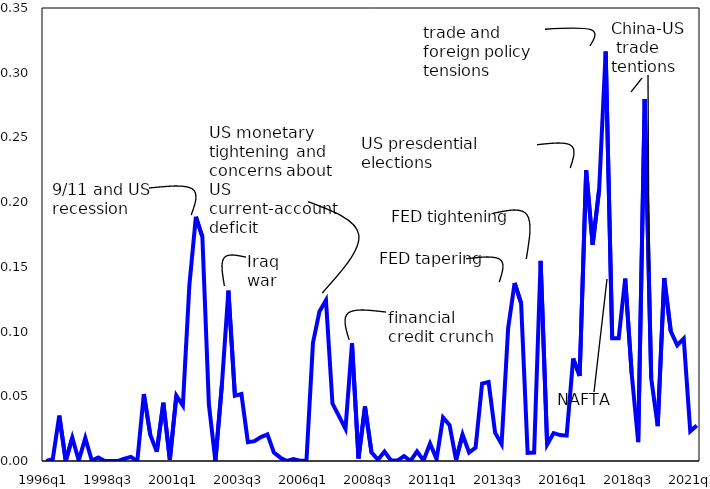
| Category | Series 0 |
|---|---|
| 1996q1 | 0 |
| 1996q2 | 0.001 |
| 1996q3 | 0.035 |
| 1996q4 | 0 |
| 1997q1 | 0.018 |
| 1997q2 | 0 |
| 1997q3 | 0.018 |
| 1997q4 | 0 |
| 1998q1 | 0.003 |
| 1998q2 | 0 |
| 1998q3 | 0 |
| 1998q4 | 0 |
| 1999q1 | 0.002 |
| 1999q2 | 0.003 |
| 1999q3 | 0 |
| 1999q4 | 0.052 |
| 2000q1 | 0.02 |
| 2000q2 | 0.007 |
| 2000q3 | 0.045 |
| 2000q4 | 0.001 |
| 2001q1 | 0.05 |
| 2001q2 | 0.043 |
| 2001q3 | 0.136 |
| 2001q4 | 0.189 |
| 2002q1 | 0.173 |
| 2002q2 | 0.044 |
| 2002q3 | 0 |
| 2002q4 | 0.059 |
| 2003q1 | 0.132 |
| 2003q2 | 0.05 |
| 2003q3 | 0.052 |
| 2003q4 | 0.015 |
| 2004q1 | 0.015 |
| 2004q2 | 0.018 |
| 2004q3 | 0.021 |
| 2004q4 | 0.006 |
| 2005q1 | 0.003 |
| 2005q2 | 0 |
| 2005q3 | 0.001 |
| 2005q4 | 0 |
| 2006q1 | 0 |
| 2006q2 | 0.091 |
| 2006q3 | 0.116 |
| 2006q4 | 0.124 |
| 2007q1 | 0.044 |
| 2007q2 | 0.035 |
| 2007q3 | 0.025 |
| 2007q4 | 0.091 |
| 2008q1 | 0.002 |
| 2008q2 | 0.042 |
| 2008q3 | 0.007 |
| 2008q4 | 0.001 |
| 2009q1 | 0.007 |
| 2009q2 | 0 |
| 2009q3 | 0 |
| 2009q4 | 0.004 |
| 2010q1 | 0 |
| 2010q2 | 0.007 |
| 2010q3 | 0 |
| 2010q4 | 0.013 |
| 2011q1 | 0.002 |
| 2011q2 | 0.034 |
| 2011q3 | 0.028 |
| 2011q4 | 0.001 |
| 2012q1 | 0.02 |
| 2012q2 | 0.007 |
| 2012q3 | 0.01 |
| 2012q4 | 0.06 |
| 2013q1 | 0.061 |
| 2013q2 | 0.022 |
| 2013q3 | 0.013 |
| 2013q4 | 0.102 |
| 2014q1 | 0.138 |
| 2014q2 | 0.122 |
| 2014q3 | 0.006 |
| 2014q4 | 0.007 |
| 2015q1 | 0.155 |
| 2015q2 | 0.013 |
| 2015q3 | 0.022 |
| 2015q4 | 0.02 |
| 2016q1 | 0.02 |
| 2016q2 | 0.079 |
| 2016q3 | 0.066 |
| 2016q4 | 0.225 |
| 2017q1 | 0.167 |
| 2017q2 | 0.21 |
| 2017q3 | 0.316 |
| 2017q4 | 0.095 |
| 2018q1 | 0.095 |
| 2018q2 | 0.141 |
| 2018q3 | 0.067 |
| 2018q4 | 0.015 |
| 2019q1 | 0.28 |
| 2019q2 | 0.064 |
| 2019q3 | 0.027 |
| 2019q4 | 0.141 |
| 2020q1 | 0.1 |
| 2020q2 | 0.089 |
| 2020q3 | 0.095 |
| 2020q4 | 0.023 |
| 2021q1 | 0.027 |